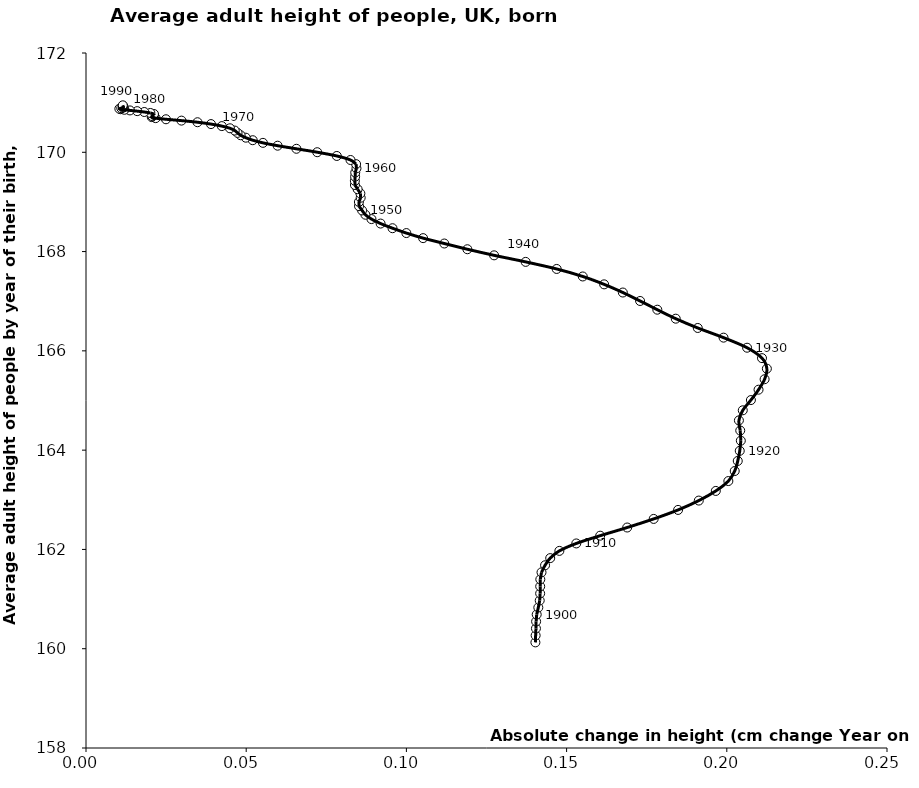
| Category | Series 0 |
|---|---|
| 0.1402624999999773 | 160.127 |
| 0.14033554999998898 | 160.268 |
| 0.1404325750000055 | 160.408 |
| 0.14048167500000375 | 160.549 |
| 0.14066837500000418 | 160.689 |
| 0.14117209999999147 | 160.83 |
| 0.14161137499999654 | 160.971 |
| 0.1417443500000104 | 161.113 |
| 0.14176095000000544 | 161.255 |
| 0.14179332500000896 | 161.397 |
| 0.14216944999999725 | 161.538 |
| 0.14328025000000366 | 161.681 |
| 0.14488440000000935 | 161.825 |
| 0.1477449249999836 | 161.971 |
| 0.1530237999999855 | 162.121 |
| 0.1604801249999923 | 162.277 |
| 0.16890740000000903 | 162.441 |
| 0.17717622500001085 | 162.615 |
| 0.18479304999999613 | 162.796 |
| 0.19126174999999535 | 162.984 |
| 0.19656587500000455 | 163.178 |
| 0.20048630000000855 | 163.377 |
| 0.20247164999999256 | 163.579 |
| 0.2034200749999968 | 163.782 |
| 0.20404122500001165 | 163.986 |
| 0.2043735999999967 | 164.19 |
| 0.20419599999999605 | 164.395 |
| 0.20377870000000087 | 164.599 |
| 0.20498614999999631 | 164.802 |
| 0.20752367500000446 | 165.009 |
| 0.20990810000000693 | 165.218 |
| 0.21179850000000044 | 165.428 |
| 0.21250762500000064 | 165.641 |
| 0.2109837249999913 | 165.854 |
| 0.20633134999998504 | 166.063 |
| 0.19898210000000915 | 166.266 |
| 0.19093732500000726 | 166.461 |
| 0.18406612500000108 | 166.648 |
| 0.1783122249999991 | 166.829 |
| 0.1729363249999949 | 167.005 |
| 0.16755532499999504 | 167.175 |
| 0.1617088750000022 | 167.34 |
| 0.15504417500000045 | 167.498 |
| 0.14690397500000074 | 167.65 |
| 0.13722124999999608 | 167.792 |
| 0.1273736999999926 | 167.924 |
| 0.11902877500000386 | 168.047 |
| 0.11182880000001205 | 168.162 |
| 0.10521434999999713 | 168.271 |
| 0.0999884499999979 | 168.373 |
| 0.09566157500000827 | 168.471 |
| 0.09194782499999121 | 168.564 |
| 0.08909394999999165 | 168.655 |
| 0.08720427500000483 | 168.742 |
| 0.08616862499999911 | 168.829 |
| 0.08521045000000527 | 168.915 |
| 0.08517437500000824 | 168.999 |
| 0.08573369999999159 | 169.085 |
| 0.08563272499999641 | 169.171 |
| 0.0847793000000081 | 169.256 |
| 0.08393510000000504 | 169.34 |
| 0.08391199999999799 | 169.424 |
| 0.08399380000000178 | 169.508 |
| 0.08403102500000159 | 169.592 |
| 0.08441862499999786 | 169.676 |
| 0.08429722500000025 | 169.761 |
| 0.08255250000000558 | 169.845 |
| 0.0782773999999904 | 169.926 |
| 0.07216512499999794 | 170.001 |
| 0.06567920000000527 | 170.07 |
| 0.05980800000000386 | 170.133 |
| 0.055223649999987856 | 170.19 |
| 0.052043774999987136 | 170.243 |
| 0.04987430000001325 | 170.294 |
| 0.048269175000001496 | 170.343 |
| 0.04730339999998989 | 170.391 |
| 0.0464341999999931 | 170.438 |
| 0.044930475000015235 | 170.484 |
| 0.042398700000006784 | 170.527 |
| 0.03900777500000174 | 170.568 |
| 0.03479684999999222 | 170.605 |
| 0.02979389999998716 | 170.638 |
| 0.024961850000011054 | 170.665 |
| 0.02173442500000533 | 170.688 |
| 0.020527224999995042 | 170.709 |
| 0.020671674999988454 | 170.729 |
| 0.021234250000006227 | 170.75 |
| 0.021208975000007513 | 170.771 |
| 0.020088349999994648 | 170.792 |
| 0.018185375000001613 | 170.812 |
| 0.015975174999994124 | 170.829 |
| 0.013714074999995773 | 170.843 |
| 0.011988525000006689 | 170.856 |
| 0.010759975000013355 | 170.867 |
| 0.01041092500000218 | 170.878 |
| 0.011004599999992593 | 170.888 |
| 0.01161307499999964 | 170.9 |
| 0.011709324999998216 | 170.911 |
| 0.011604449999992994 | 170.923 |
| 0.011544950000001108 | 170.935 |
| 0.011485450000009223 | 170.946 |